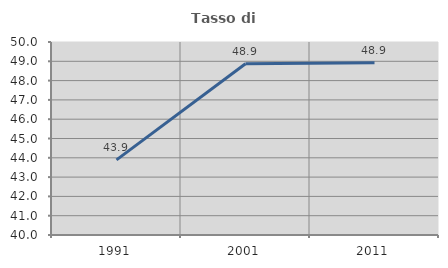
| Category | Tasso di occupazione   |
|---|---|
| 1991.0 | 43.893 |
| 2001.0 | 48.875 |
| 2011.0 | 48.919 |